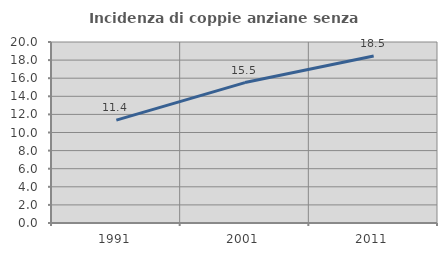
| Category | Incidenza di coppie anziane senza figli  |
|---|---|
| 1991.0 | 11.369 |
| 2001.0 | 15.516 |
| 2011.0 | 18.455 |